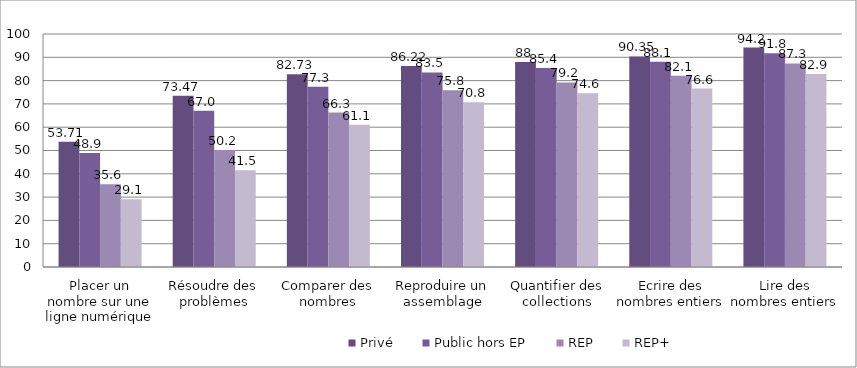
| Category | Privé | Public hors EP | REP | REP+ |
|---|---|---|---|---|
| Placer un nombre sur une ligne numérique | 53.71 | 48.89 | 35.55 | 29.12 |
| Résoudre des problèmes | 73.47 | 67.01 | 50.21 | 41.51 |
| Comparer des nombres | 82.73 | 77.32 | 66.26 | 61.08 |
| Reproduire un assemblage | 86.22 | 83.53 | 75.82 | 70.76 |
| Quantifier des collections | 88 | 85.4 | 79.19 | 74.59 |
| Ecrire des nombres entiers | 90.35 | 88.14 | 82.07 | 76.58 |
| Lire des nombres entiers | 94.2 | 91.76 | 87.34 | 82.88 |